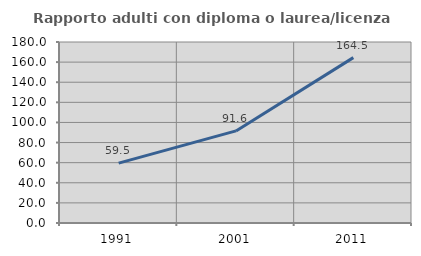
| Category | Rapporto adulti con diploma o laurea/licenza media  |
|---|---|
| 1991.0 | 59.524 |
| 2001.0 | 91.579 |
| 2011.0 | 164.474 |